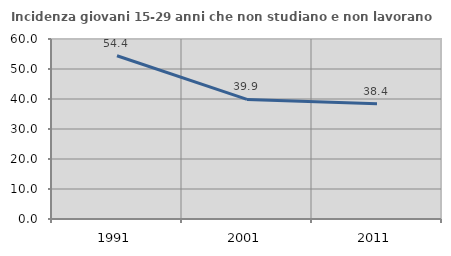
| Category | Incidenza giovani 15-29 anni che non studiano e non lavorano  |
|---|---|
| 1991.0 | 54.423 |
| 2001.0 | 39.856 |
| 2011.0 | 38.418 |